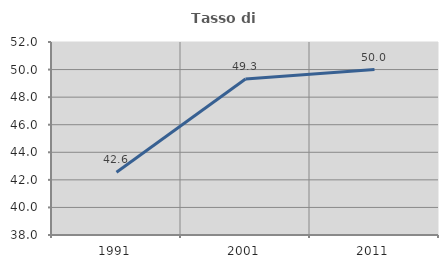
| Category | Tasso di occupazione   |
|---|---|
| 1991.0 | 42.553 |
| 2001.0 | 49.319 |
| 2011.0 | 50 |